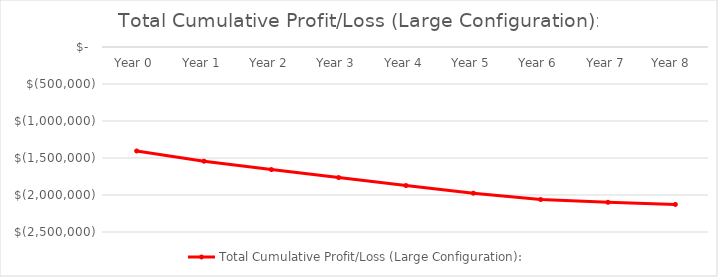
| Category | Total Cumulative Profit/Loss (Large Configuration): |
|---|---|
| Year 0 | -1405000 |
| Year 1 | -1543442.96 |
| Year 2 | -1656073.92 |
| Year 3 | -1764263.726 |
| Year 4 | -1872236.378 |
| Year 5 | -1975697.722 |
| Year 6 | -2061091.594 |
| Year 7 | -2098214.377 |
| Year 8  | -2127586.16 |